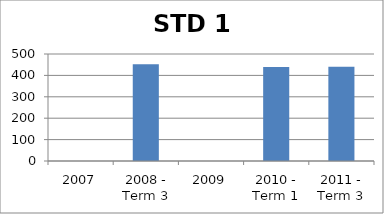
| Category | Score |
|---|---|
| 2007 | 0 |
| 2008 - Term 3 | 452.66 |
| 2009 | 0 |
| 2010 - Term 1 | 439.6 |
| 2011 - Term 3 | 440.5 |